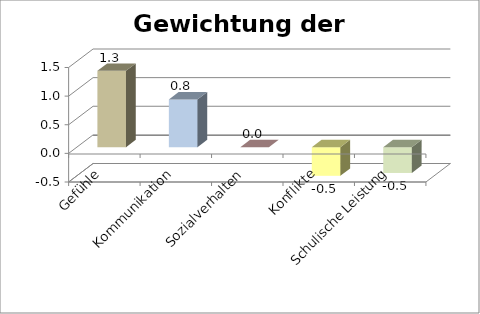
| Category | Series 0 |
|---|---|
| Gefühle | 1.333 |
| Kommunikation | 0.833 |
| Sozialverhalten | 0 |
| Konflikte | -0.5 |
| Schulische Leistung | -0.45 |